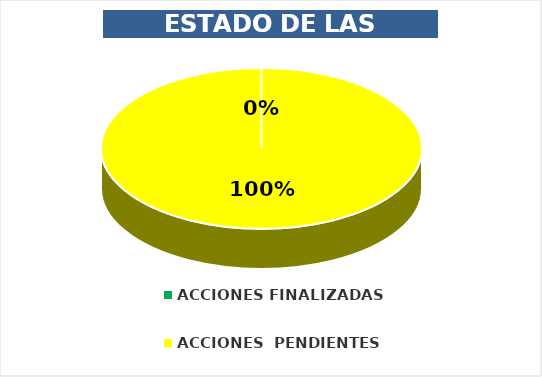
| Category | Series 0 |
|---|---|
| ACCIONES FINALIZADAS | 0 |
| ACCIONES  PENDIENTES | 44 |